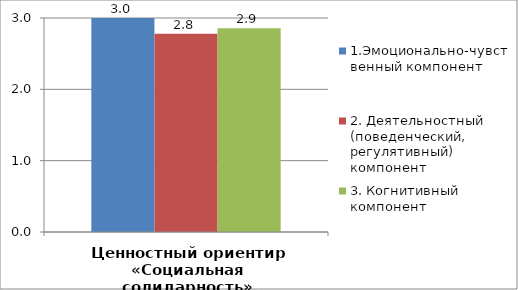
| Category | 1.Эмоционально-чувственный компонент | 2. Деятельностный (поведенческий, регулятивный) компонент | 3. Когнитивный компонент |
|---|---|---|---|
| Ценностный ориентир «Социальная солидарность» | 3 | 2.778 | 2.857 |